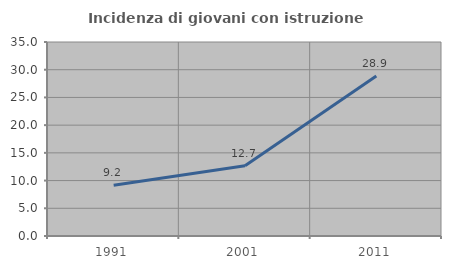
| Category | Incidenza di giovani con istruzione universitaria |
|---|---|
| 1991.0 | 9.158 |
| 2001.0 | 12.685 |
| 2011.0 | 28.86 |